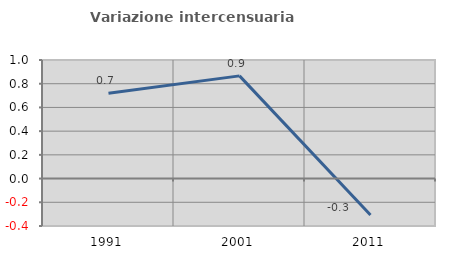
| Category | Variazione intercensuaria annua |
|---|---|
| 1991.0 | 0.72 |
| 2001.0 | 0.866 |
| 2011.0 | -0.306 |